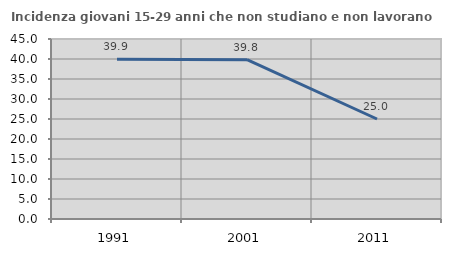
| Category | Incidenza giovani 15-29 anni che non studiano e non lavorano  |
|---|---|
| 1991.0 | 39.932 |
| 2001.0 | 39.823 |
| 2011.0 | 25 |